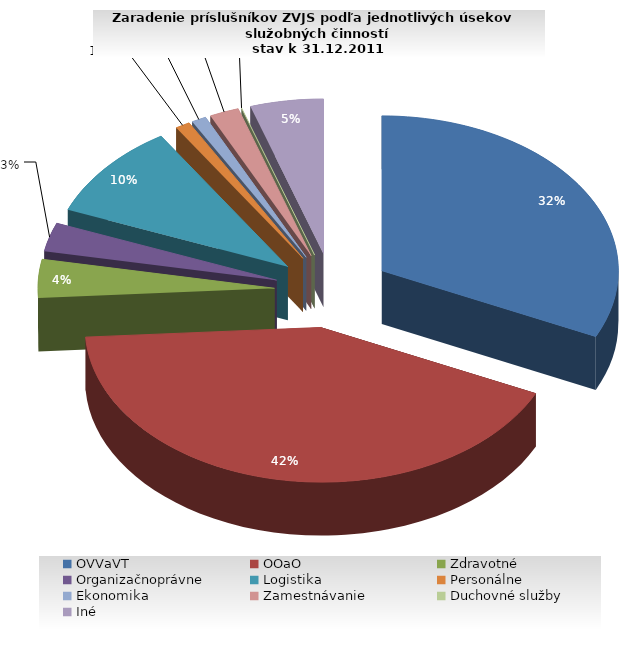
| Category | Series 0 |
|---|---|
| OVVaVT | 32 |
| OOaO | 42 |
| Zdravotné | 4 |
| Organizačnoprávne | 3 |
| Logistika | 10 |
| Personálne | 1 |
| Ekonomika | 1 |
| Zamestnávanie | 2 |
| Duchovné služby | 0 |
| Iné | 5 |